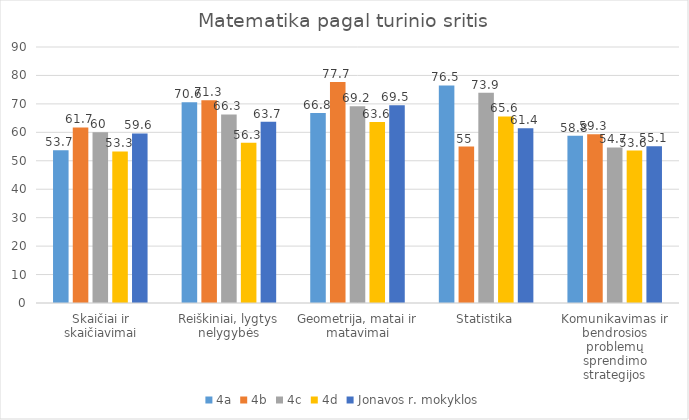
| Category | 4a | 4b | 4c | 4d | Jonavos r. mokyklos |
|---|---|---|---|---|---|
| Skaičiai ir skaičiavimai | 53.7 | 61.7 | 60 | 53.3 | 59.6 |
| Reiškiniai, lygtys nelygybės | 70.6 | 71.3 | 66.3 | 56.3 | 63.7 |
| Geometrija, matai ir matavimai | 66.8 | 77.7 | 69.2 | 63.6 | 69.5 |
| Statistika | 76.5 | 55 | 73.9 | 65.6 | 61.4 |
| Komunikavimas ir bendrosios problemų sprendimo strategijos | 58.8 | 59.3 | 54.7 | 53.6 | 55.1 |